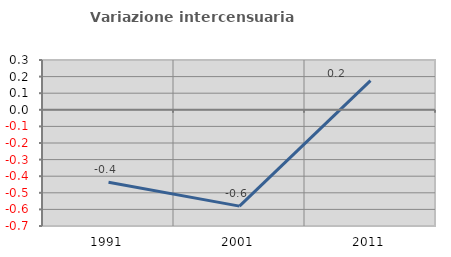
| Category | Variazione intercensuaria annua |
|---|---|
| 1991.0 | -0.436 |
| 2001.0 | -0.58 |
| 2011.0 | 0.176 |